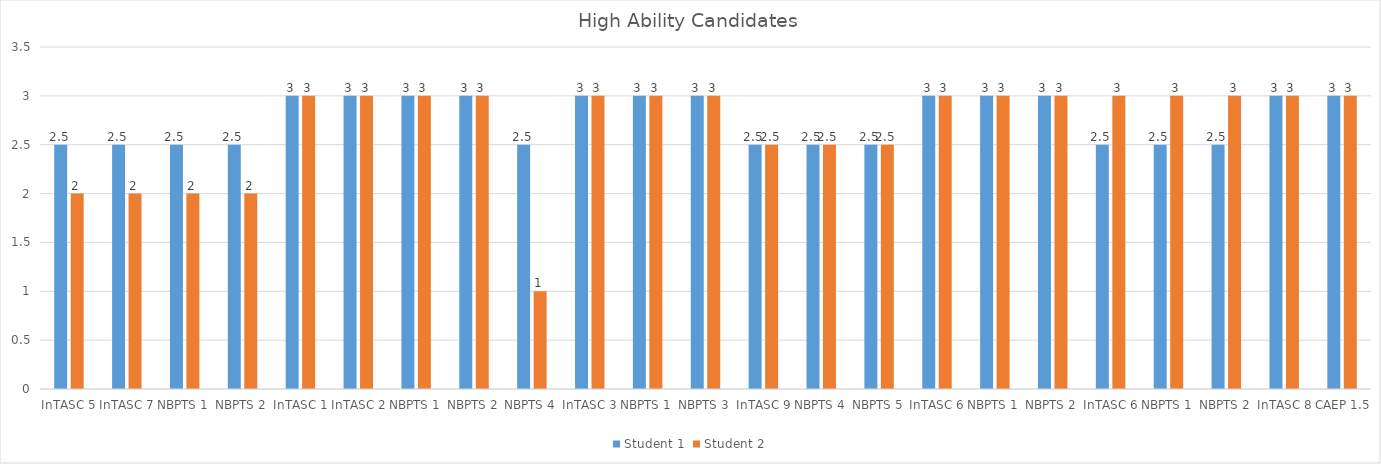
| Category | Student 1 | Student 2 |
|---|---|---|
| InTASC 5 | 2.5 | 2 |
| InTASC 7 | 2.5 | 2 |
| NBPTS 1 | 2.5 | 2 |
| NBPTS 2 | 2.5 | 2 |
| InTASC 1 | 3 | 3 |
| InTASC 2 | 3 | 3 |
| NBPTS 1 | 3 | 3 |
| NBPTS 2 | 3 | 3 |
| NBPTS 4 | 2.5 | 1 |
| InTASC 3 | 3 | 3 |
| NBPTS 1 | 3 | 3 |
| NBPTS 3 | 3 | 3 |
| InTASC 9 | 2.5 | 2.5 |
| NBPTS 4 | 2.5 | 2.5 |
| NBPTS 5 | 2.5 | 2.5 |
| InTASC 6 | 3 | 3 |
| NBPTS 1 | 3 | 3 |
| NBPTS 2 | 3 | 3 |
| InTASC 6 | 2.5 | 3 |
| NBPTS 1 | 2.5 | 3 |
| NBPTS 2 | 2.5 | 3 |
| InTASC 8 | 3 | 3 |
| CAEP 1.5 | 3 | 3 |